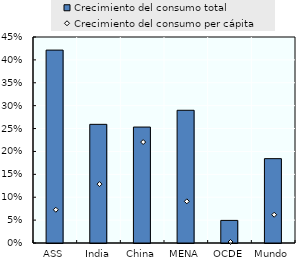
| Category | Crecimiento del consumo total |
|---|---|
| ASS | 0.421 |
| India | 0.259 |
| China | 0.253 |
| MENA | 0.29 |
| OCDE | 0.049 |
| Mundo | 0.184 |